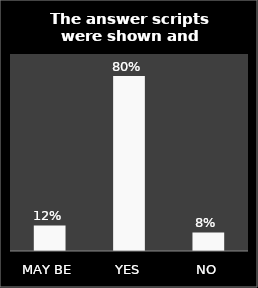
| Category | Series 0 |
|---|---|
| MAY BE | 0.117 |
| YES | 0.8 |
| NO | 0.085 |